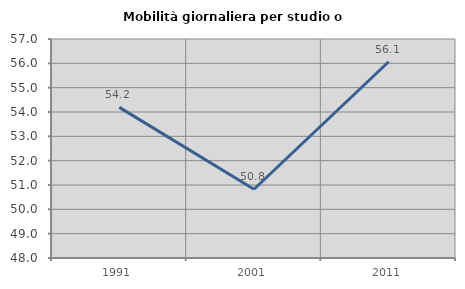
| Category | Mobilità giornaliera per studio o lavoro |
|---|---|
| 1991.0 | 54.19 |
| 2001.0 | 50.824 |
| 2011.0 | 56.065 |